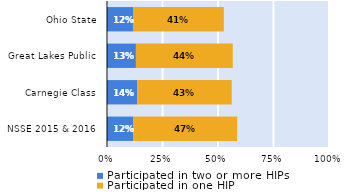
| Category | Participated in two or more HIPs | Participated in one HIP |
|---|---|---|
| NSSE 2015 & 2016 | 0.118 | 0.469 |
| Carnegie Class | 0.136 | 0.426 |
| Great Lakes Public | 0.13 | 0.436 |
| Ohio State | 0.119 | 0.407 |